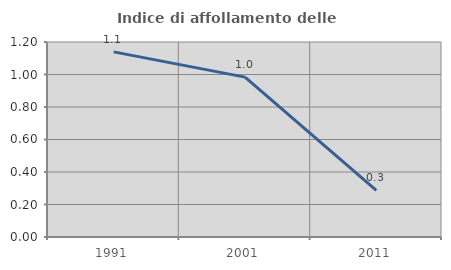
| Category | Indice di affollamento delle abitazioni  |
|---|---|
| 1991.0 | 1.139 |
| 2001.0 | 0.984 |
| 2011.0 | 0.287 |